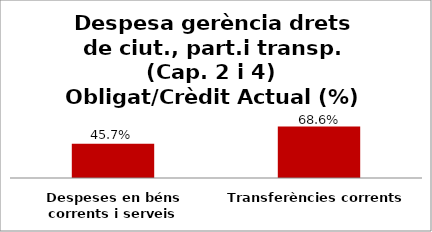
| Category | Series 0 |
|---|---|
| Despeses en béns corrents i serveis | 0.457 |
| Transferències corrents | 0.686 |